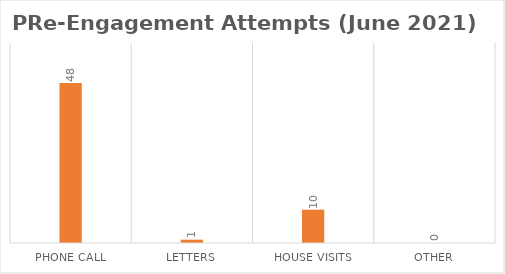
| Category | Series 0 |
|---|---|
| Phone call | 48 |
| Letters | 1 |
| House Visits | 10 |
| Other | 0 |